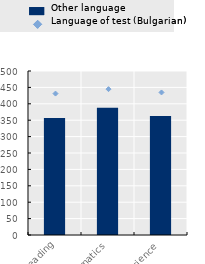
| Category | Other language |
|---|---|
| Reading | 357.06 |
| Mathematics | 387.84 |
| Science | 363.17 |